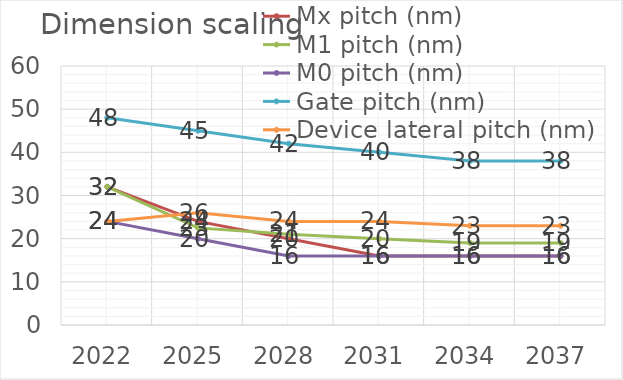
| Category | Mx pitch (nm) | M1 pitch (nm) | M0 pitch (nm) | Gate pitch (nm) | Device lateral pitch (nm) |
|---|---|---|---|---|---|
| 2022.0 | 32 | 32 | 24 | 48 | 24 |
| 2025.0 | 24 | 22.5 | 20 | 45 | 26 |
| 2028.0 | 20 | 21 | 16 | 42 | 24 |
| 2031.0 | 16 | 20 | 16 | 40 | 24 |
| 2034.0 | 16 | 19 | 16 | 38 | 23 |
| 2037.0 | 16 | 19 | 16 | 38 | 23 |